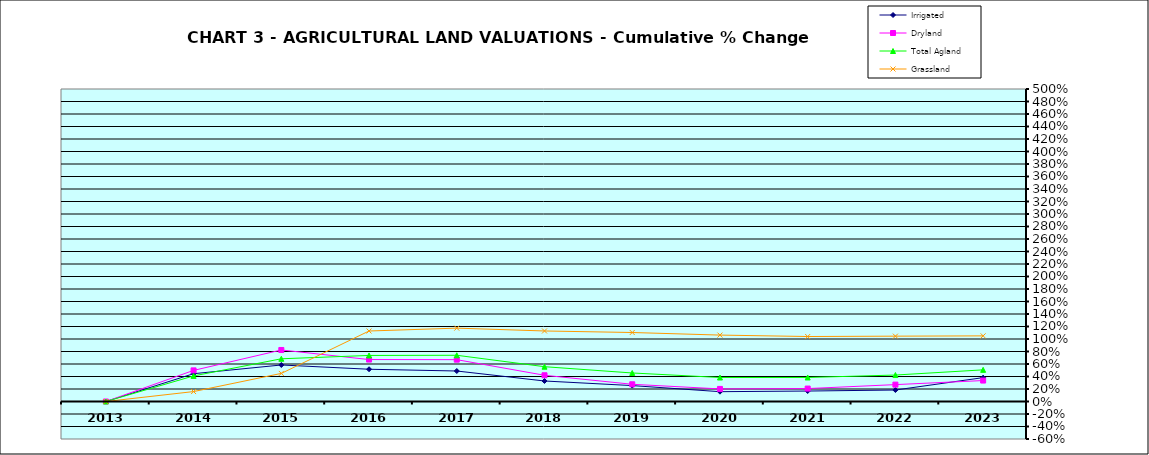
| Category | Irrigated | Dryland | Total Agland | Grassland |
|---|---|---|---|---|
| 2013.0 | 0 | 0 | 0 | 0 |
| 2014.0 | 0.445 | 0.498 | 0.409 | 0.159 |
| 2015.0 | 0.584 | 0.824 | 0.683 | 0.449 |
| 2016.0 | 0.516 | 0.671 | 0.737 | 1.128 |
| 2017.0 | 0.488 | 0.669 | 0.74 | 1.174 |
| 2018.0 | 0.328 | 0.42 | 0.557 | 1.128 |
| 2019.0 | 0.255 | 0.275 | 0.456 | 1.104 |
| 2020.0 | 0.157 | 0.201 | 0.384 | 1.063 |
| 2021.0 | 0.167 | 0.207 | 0.384 | 1.04 |
| 2022.0 | 0.184 | 0.27 | 0.423 | 1.045 |
| 2023.0 | 0.382 | 0.335 | 0.506 | 1.05 |